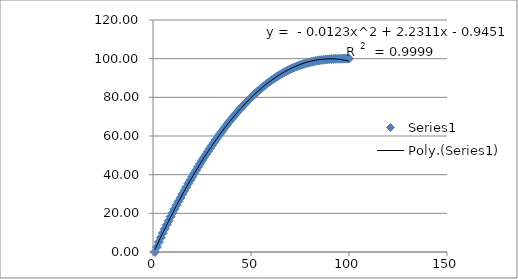
| Category | Series 0 |
|---|---|
| 100.0 | 100 |
| 99.0 | 100 |
| 98.0 | 100 |
| 97.0 | 99.99 |
| 96.0 | 99.98 |
| 95.0 | 99.96 |
| 94.0 | 99.94 |
| 93.0 | 99.91 |
| 92.0 | 99.86 |
| 91.0 | 99.8 |
| 90.0 | 99.72 |
| 89.0 | 99.65 |
| 88.0 | 99.54 |
| 87.0 | 99.44 |
| 86.0 | 99.3 |
| 85.0 | 99.16 |
| 84.0 | 98.99 |
| 83.0 | 98.82 |
| 82.0 | 98.61 |
| 81.0 | 98.4 |
| 80.0 | 98.14 |
| 79.0 | 97.89 |
| 78.0 | 97.6 |
| 77.0 | 97.31 |
| 76.0 | 96.97 |
| 75.0 | 96.63 |
| 74.0 | 96.25 |
| 73.0 | 95.87 |
| 72.0 | 95.44 |
| 71.0 | 95 |
| 70.0 | 94.52 |
| 69.0 | 94.05 |
| 68.0 | 93.52 |
| 67.0 | 92.99 |
| 66.0 | 92.41 |
| 65.0 | 91.83 |
| 64.0 | 91.2 |
| 63.0 | 90.57 |
| 62.0 | 89.88 |
| 61.0 | 89.2 |
| 60.0 | 88.46 |
| 59.0 | 87.73 |
| 58.0 | 86.94 |
| 57.0 | 86.16 |
| 56.0 | 85.33 |
| 55.0 | 84.5 |
| 54.0 | 83.61 |
| 53.0 | 82.72 |
| 52.0 | 81.78 |
| 51.0 | 80.85 |
| 50.0 | 79.86 |
| 49.0 | 78.87 |
| 48.0 | 77.83 |
| 47.0 | 76.79 |
| 46.0 | 75.7 |
| 45.0 | 74.61 |
| 44.0 | 73.48 |
| 43.0 | 72.34 |
| 42.0 | 71.15 |
| 41.0 | 69.96 |
| 40.0 | 68.72 |
| 39.0 | 67.48 |
| 38.0 | 66.19 |
| 37.0 | 64.9 |
| 36.0 | 63.56 |
| 35.0 | 62.22 |
| 34.0 | 60.82 |
| 33.0 | 59.43 |
| 32.0 | 57.99 |
| 31.0 | 56.55 |
| 30.0 | 55.06 |
| 29.0 | 53.56 |
| 28.0 | 52.02 |
| 27.0 | 50.48 |
| 26.0 | 48.88 |
| 25.0 | 47.29 |
| 24.0 | 45.65 |
| 23.0 | 44.01 |
| 22.0 | 42.32 |
| 21.0 | 40.63 |
| 20.0 | 38.89 |
| 19.0 | 37.15 |
| 18.0 | 35.36 |
| 17.0 | 33.57 |
| 16.0 | 31.73 |
| 15.0 | 29.89 |
| 14.0 | 28 |
| 13.0 | 26.12 |
| 12.0 | 24.18 |
| 11.0 | 22.25 |
| 10.0 | 20.25 |
| 9.0 | 18.25 |
| 8.0 | 16.18 |
| 7.0 | 14.11 |
| 6.0 | 11.94 |
| 5.0 | 9.77 |
| 4.0 | 7.46 |
| 3.0 | 5.14 |
| 2.0 | 2.57 |
| 1.0 | 0 |